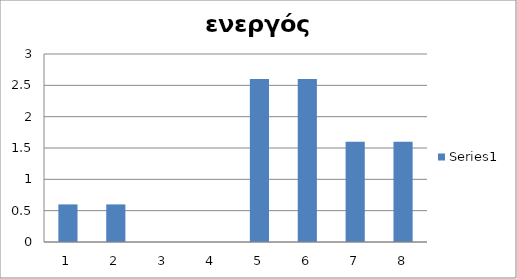
| Category | Series 0 |
|---|---|
| 0 | 0.6 |
| 1 | 0.6 |
| 2 | 0 |
| 3 | 0 |
| 4 | 2.6 |
| 5 | 2.6 |
| 6 | 1.6 |
| 7 | 1.6 |